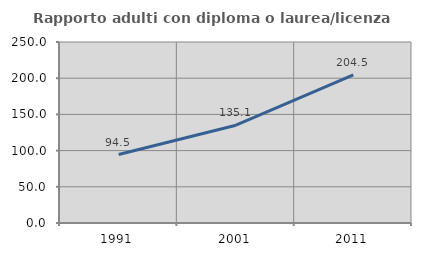
| Category | Rapporto adulti con diploma o laurea/licenza media  |
|---|---|
| 1991.0 | 94.538 |
| 2001.0 | 135.069 |
| 2011.0 | 204.467 |